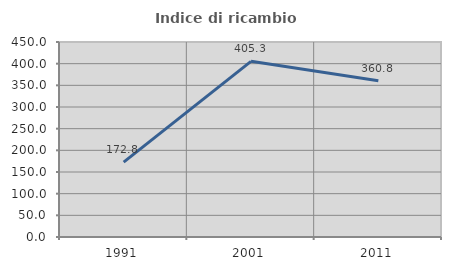
| Category | Indice di ricambio occupazionale  |
|---|---|
| 1991.0 | 172.848 |
| 2001.0 | 405.333 |
| 2011.0 | 360.784 |